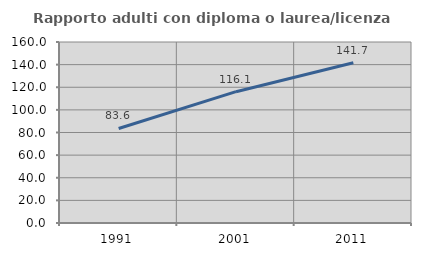
| Category | Rapporto adulti con diploma o laurea/licenza media  |
|---|---|
| 1991.0 | 83.565 |
| 2001.0 | 116.078 |
| 2011.0 | 141.708 |